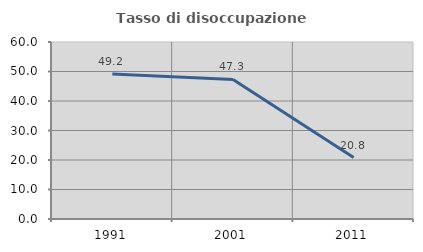
| Category | Tasso di disoccupazione giovanile  |
|---|---|
| 1991.0 | 49.153 |
| 2001.0 | 47.312 |
| 2011.0 | 20.833 |